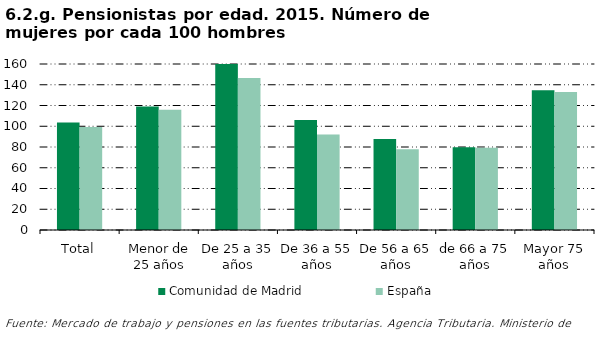
| Category | Comunidad de Madrid | España |
|---|---|---|
| Total | 103.596 | 99.331 |
| Menor de 25 años | 119.057 | 116.021 |
| De 25 a 35 años | 162.849 | 146.485 |
| De 36 a 55 años | 106.144 | 91.949 |
| De 56 a 65 años | 87.631 | 77.718 |
| de 66 a 75 años | 79.742 | 79.38 |
| Mayor 75 años | 134.755 | 132.994 |